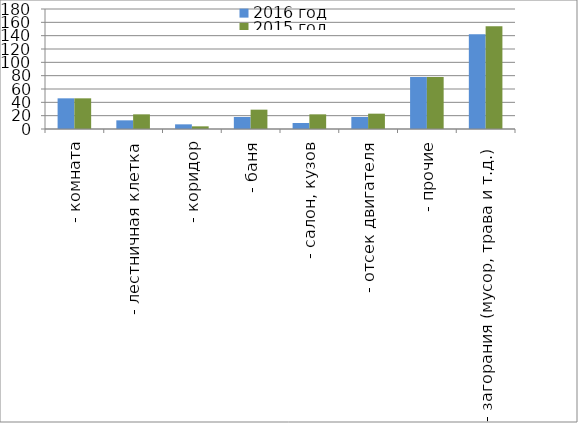
| Category | 2016 год | 2015 год |
|---|---|---|
|  - комната | 46 | 46 |
|  - лестничная клетка | 13 | 22 |
|  - коридор | 7 | 4 |
|  - баня | 18 | 29 |
|  - салон, кузов | 9 | 22 |
|  - отсек двигателя | 18 | 23 |
| - прочие | 78 | 78 |
| - загорания (мусор, трава и т.д.)  | 142 | 154 |